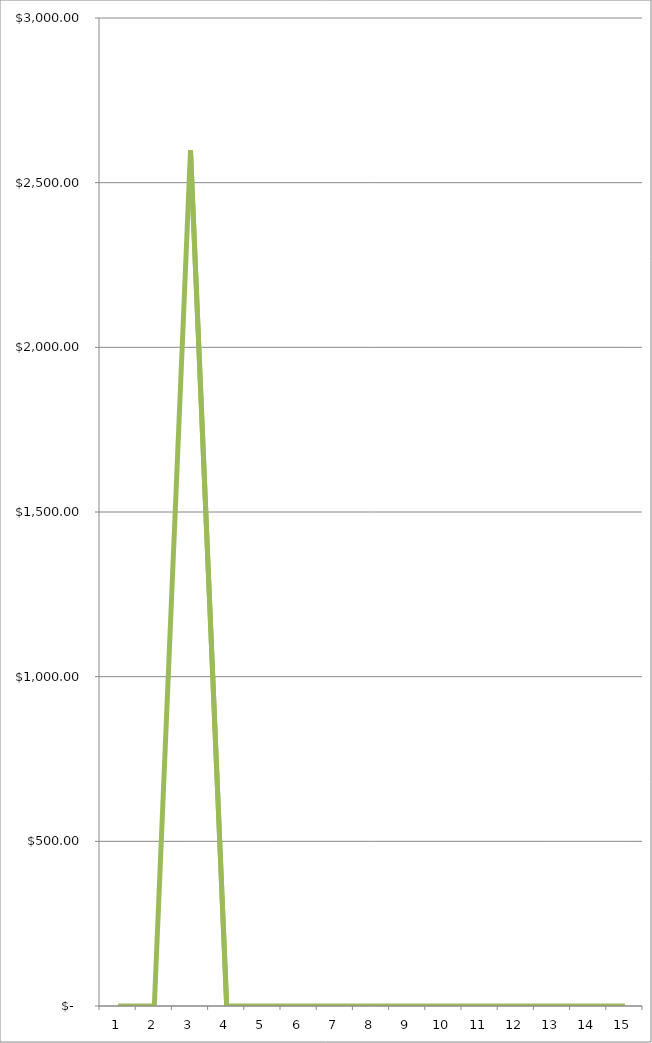
| Category | Series 0 |
|---|---|
| 0 | 0 |
| 1 | 0 |
| 2 | 2598.28 |
| 3 | 0 |
| 4 | 0 |
| 5 | 0 |
| 6 | 0 |
| 7 | 0 |
| 8 | 0 |
| 9 | 0 |
| 10 | 0 |
| 11 | 0 |
| 12 | 0 |
| 13 | 0 |
| 14 | 0 |